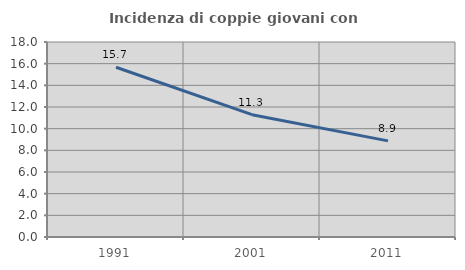
| Category | Incidenza di coppie giovani con figli |
|---|---|
| 1991.0 | 15.67 |
| 2001.0 | 11.293 |
| 2011.0 | 8.874 |